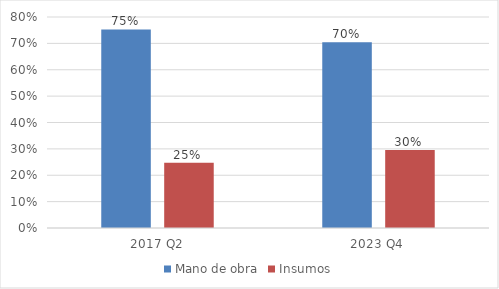
| Category | Mano de obra | Insumos |
|---|---|---|
| 2017 Q2 | 0.753 | 0.247 |
| 2023 Q4 | 0.704 | 0.296 |